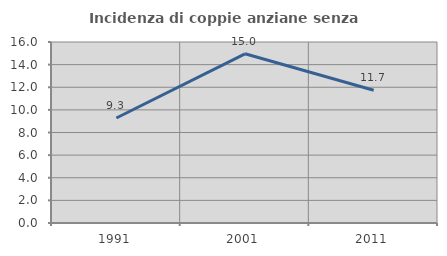
| Category | Incidenza di coppie anziane senza figli  |
|---|---|
| 1991.0 | 9.283 |
| 2001.0 | 14.957 |
| 2011.0 | 11.737 |